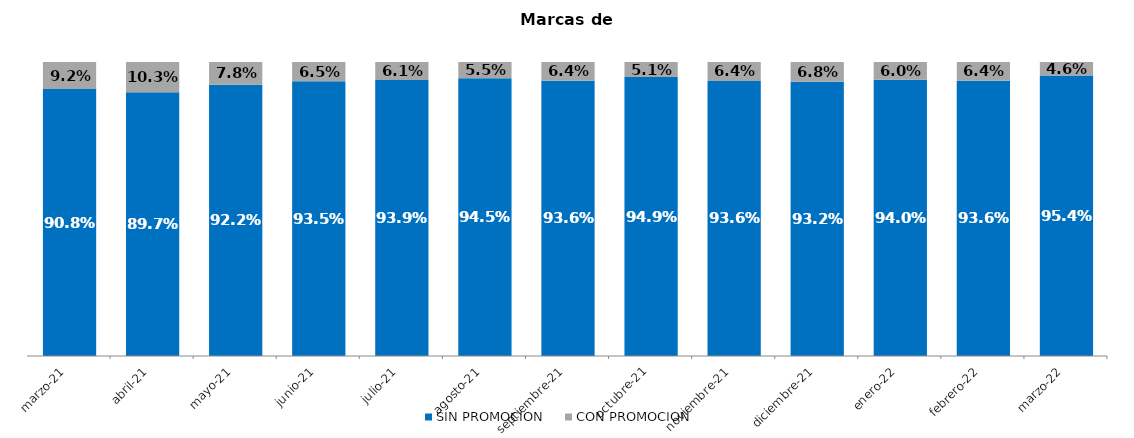
| Category | SIN PROMOCION   | CON PROMOCION   |
|---|---|---|
| 2021-03-01 | 0.908 | 0.092 |
| 2021-04-01 | 0.897 | 0.103 |
| 2021-05-01 | 0.922 | 0.078 |
| 2021-06-01 | 0.935 | 0.065 |
| 2021-07-01 | 0.939 | 0.061 |
| 2021-08-01 | 0.945 | 0.055 |
| 2021-09-01 | 0.936 | 0.064 |
| 2021-10-01 | 0.949 | 0.051 |
| 2021-11-01 | 0.936 | 0.064 |
| 2021-12-01 | 0.932 | 0.068 |
| 2022-01-01 | 0.94 | 0.06 |
| 2022-02-01 | 0.936 | 0.064 |
| 2022-03-01 | 0.954 | 0.046 |